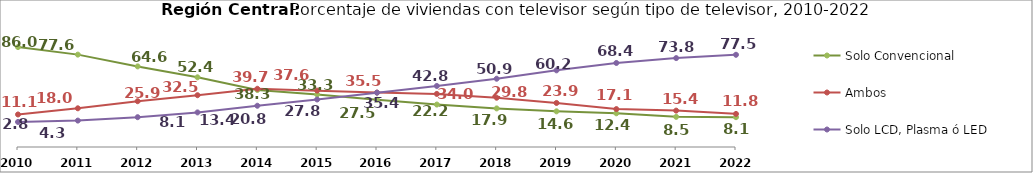
| Category | Solo Convencional | Ambos | Solo LCD, Plasma ó LED |
|---|---|---|---|
| 2010.0 | 86.021 | 11.148 | 2.831 |
| 2011.0 | 77.645 | 18.005 | 4.35 |
| 2012.0 | 64.555 | 25.879 | 8.127 |
| 2013.0 | 52.446 | 32.536 | 13.426 |
| 2014.0 | 38.343 | 39.688 | 20.836 |
| 2015.0 | 33.344 | 37.635 | 27.81 |
| 2016.0 | 27.541 | 35.463 | 35.377 |
| 2017.0 | 22.177 | 33.975 | 42.812 |
| 2018.0 | 17.876 | 29.764 | 50.863 |
| 2019.0 | 14.617 | 23.927 | 60.19 |
| 2020.0 | 12.442 | 17.137 | 68.364 |
| 2021.0 | 8.502 | 15.427 | 73.789 |
| 2022.0 | 8.148 | 11.759 | 77.474 |